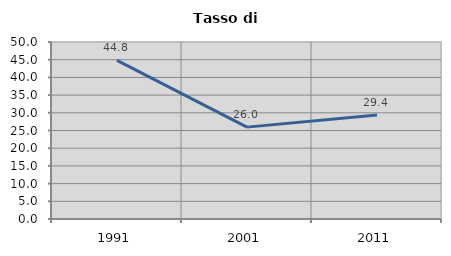
| Category | Tasso di disoccupazione   |
|---|---|
| 1991.0 | 44.789 |
| 2001.0 | 25.955 |
| 2011.0 | 29.378 |